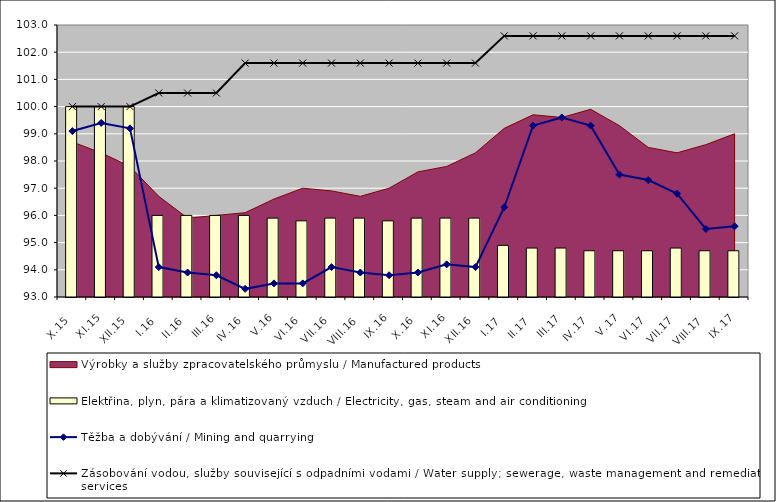
| Category | Elektřina, plyn, pára a klimatizovaný vzduch / Electricity, gas, steam and air conditioning |
|---|---|
| X.15 | 100 |
| XI.15 | 100 |
| XII.15 | 100 |
| I.16 | 96 |
| II.16 | 96 |
| III.16 | 96 |
| IV.16 | 96 |
| V.16 | 95.9 |
| VI.16 | 95.8 |
| VII.16 | 95.9 |
| VIII.16 | 95.9 |
| IX.16 | 95.8 |
| X.16 | 95.9 |
| XI.16 | 95.9 |
| XII.16 | 95.9 |
| I.17 | 94.9 |
| II.17 | 94.8 |
| III.17 | 94.8 |
| IV.17 | 94.7 |
| V.17 | 94.7 |
| VI.17 | 94.7 |
| VII.17 | 94.8 |
| VIII.17 | 94.7 |
| IX.17 | 94.7 |